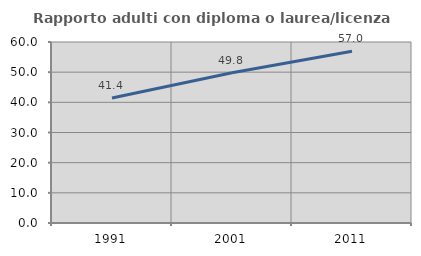
| Category | Rapporto adulti con diploma o laurea/licenza media  |
|---|---|
| 1991.0 | 41.429 |
| 2001.0 | 49.778 |
| 2011.0 | 56.962 |